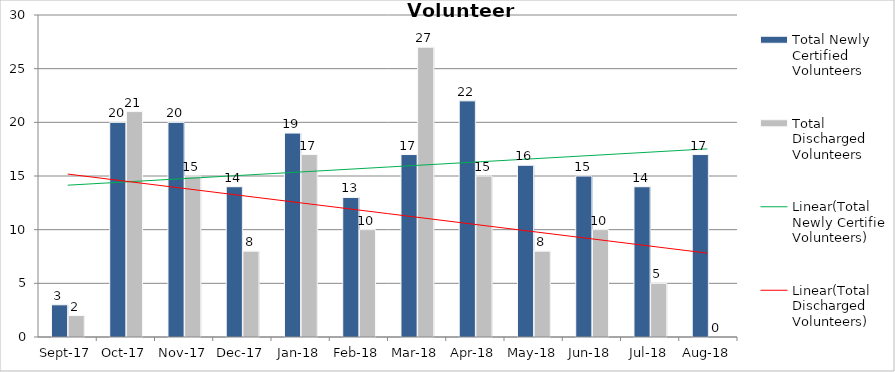
| Category | Total Newly Certified Volunteers | Total Discharged Volunteers |
|---|---|---|
| 2017-09-01 | 3 | 2 |
| 2017-10-01 | 20 | 21 |
| 2017-11-01 | 20 | 15 |
| 2017-12-01 | 14 | 8 |
| 2018-01-01 | 19 | 17 |
| 2018-02-01 | 13 | 10 |
| 2018-03-01 | 17 | 27 |
| 2018-04-01 | 22 | 15 |
| 2018-05-01 | 16 | 8 |
| 2018-06-01 | 15 | 10 |
| 2018-07-01 | 14 | 5 |
| 2018-08-01 | 17 | 0 |